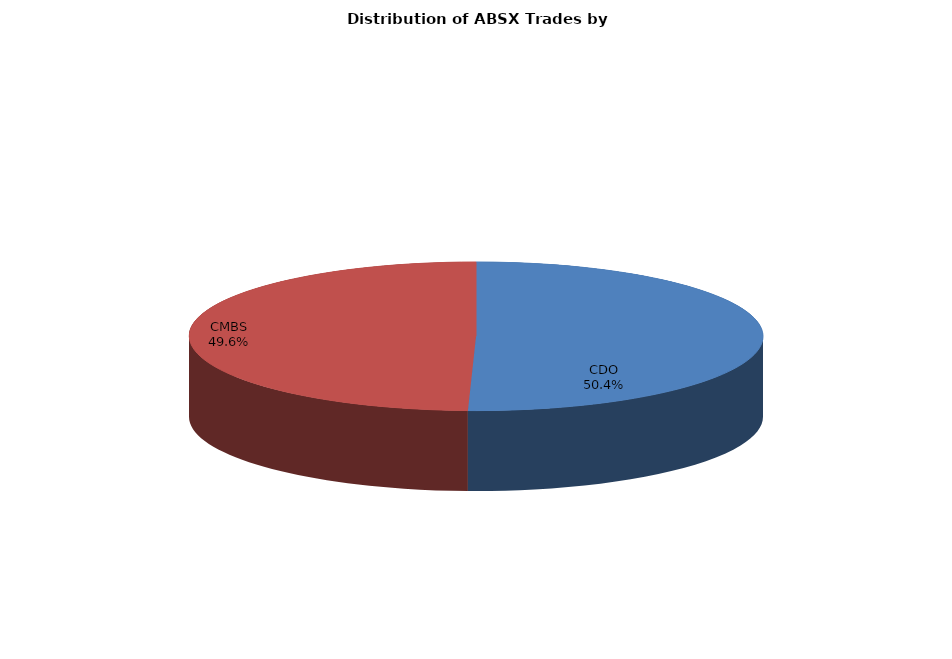
| Category | Series 0 |
|---|---|
| CDO | 252.04 |
| CMBS | 247.563 |